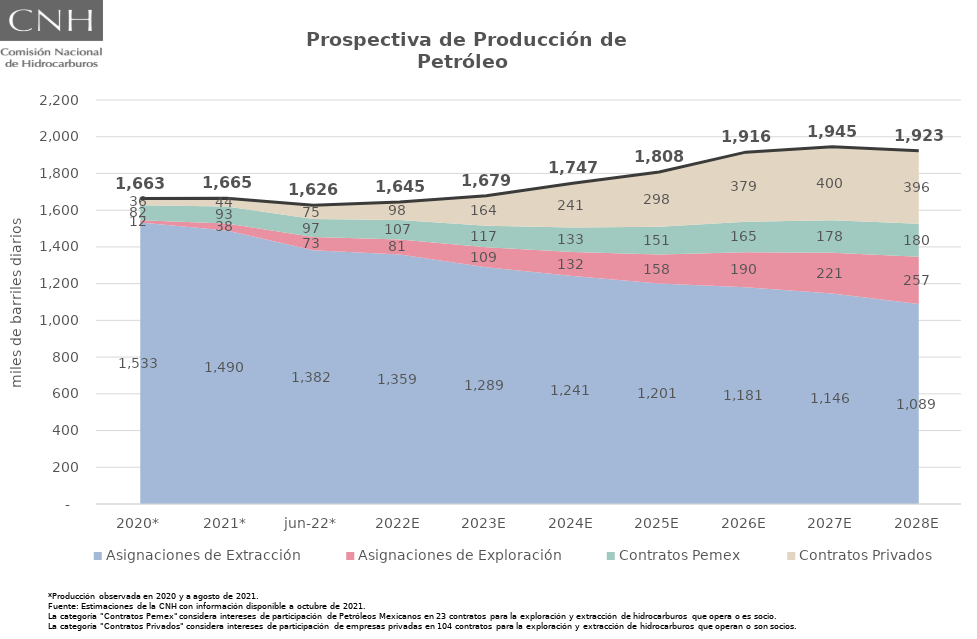
| Category | Total |
|---|---|
| 2020* | 1663.042 |
| 2021* | 1664.708 |
| jun-22* | 1626.428 |
| 2022E | 1644.93 |
| 2023E | 1679.08 |
| 2024E | 1746.672 |
| 2025E | 1807.591 |
| 2026E | 1915.996 |
| 2027E | 1945.473 |
| 2028E | 1923.08 |